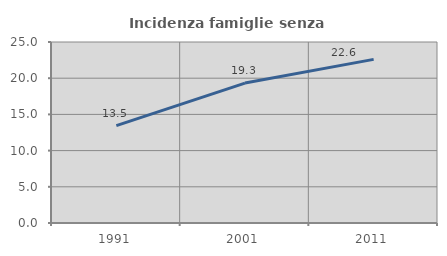
| Category | Incidenza famiglie senza nuclei |
|---|---|
| 1991.0 | 13.452 |
| 2001.0 | 19.329 |
| 2011.0 | 22.6 |